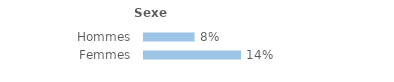
| Category | Series 0 |
|---|---|
| Hommes | 0.075 |
| Femmes | 0.145 |